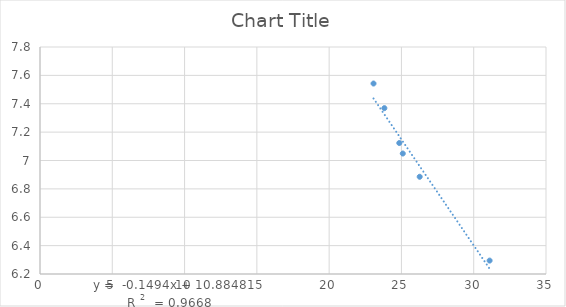
| Category | Series 0 |
|---|---|
| 23.070000000000004 | 7.543 |
| 23.820000000000004 | 7.369 |
| 24.853333333333335 | 7.123 |
| 25.093333333333334 | 7.049 |
| 26.263333333333335 | 6.885 |
| 31.099999999999998 | 6.294 |